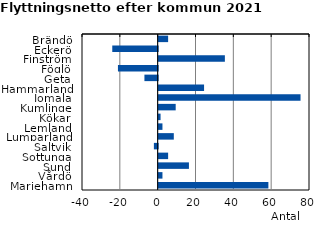
| Category | Series 0 |
|---|---|
| Brändö | 5 |
| Eckerö | -24 |
| Finström | 35 |
| Föglö | -21 |
| Geta | -7 |
| Hammarland | 24 |
| Jomala | 75 |
| Kumlinge | 9 |
| Kökar | 1 |
| Lemland | 2 |
| Lumparland | 8 |
| Saltvik | -2 |
| Sottunga | 5 |
| Sund | 16 |
| Vårdö | 2 |
| Mariehamn | 58 |